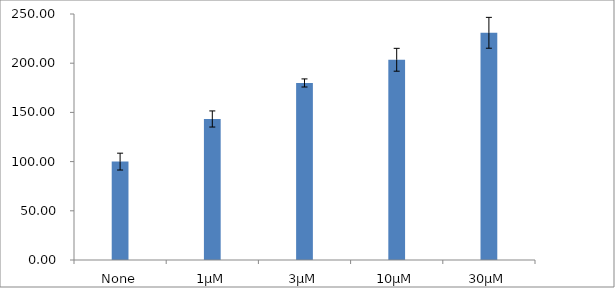
| Category | Series 0 |
|---|---|
| None | 100 |
| 1µM | 143.307 |
| 3µM | 179.915 |
| 10µM | 203.493 |
| 30µM | 230.896 |